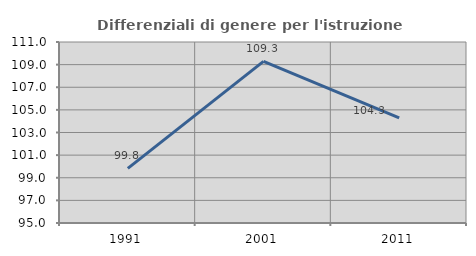
| Category | Differenziali di genere per l'istruzione superiore |
|---|---|
| 1991.0 | 99.83 |
| 2001.0 | 109.292 |
| 2011.0 | 104.292 |